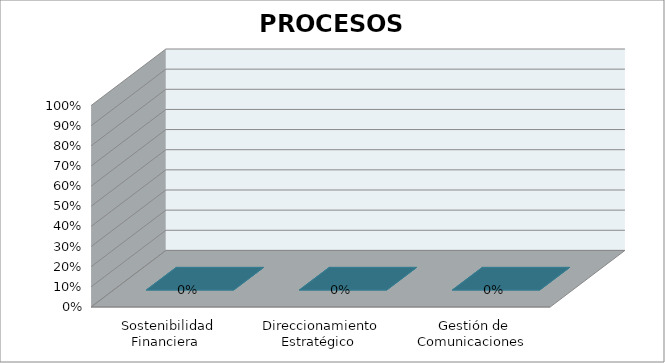
| Category | Series 0 |
|---|---|
| Sostenibilidad Financiera  | 0 |
| Direccionamiento Estratégico  | 0 |
| Gestión de Comunicaciones  | 0 |